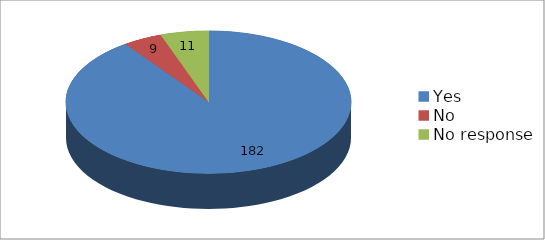
| Category | Series 0 |
|---|---|
| Yes | 182 |
| No | 9 |
| No response | 11 |